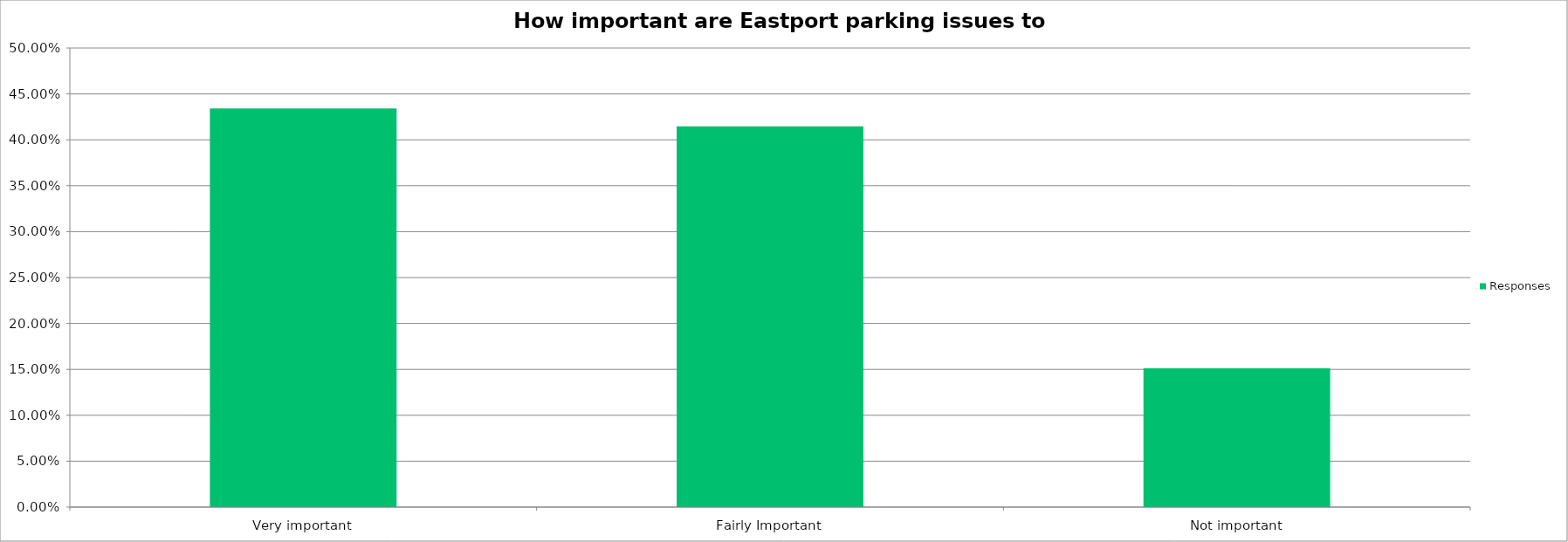
| Category | Responses |
|---|---|
| Very important | 0.434 |
| Fairly Important | 0.415 |
| Not important | 0.151 |